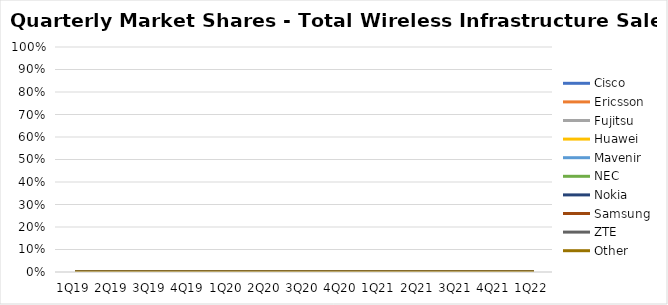
| Category | Cisco | Ericsson | Fujitsu | Huawei | Mavenir | NEC | Nokia | Samsung | ZTE | Other |
|---|---|---|---|---|---|---|---|---|---|---|
| 1Q19 | 0 | 0 | 0 | 0 | 0 | 0 | 0 | 0 | 0 | 0 |
| 2Q19 | 0 | 0 | 0 | 0 | 0 | 0 | 0 | 0 | 0 | 0 |
| 3Q19 | 0 | 0 | 0 | 0 | 0 | 0 | 0 | 0 | 0 | 0 |
| 4Q19 | 0 | 0 | 0 | 0 | 0 | 0 | 0 | 0 | 0 | 0 |
| 1Q20 | 0 | 0 | 0 | 0 | 0 | 0 | 0 | 0 | 0 | 0 |
| 2Q20 | 0 | 0 | 0 | 0 | 0 | 0 | 0 | 0 | 0 | 0 |
| 3Q20 | 0 | 0 | 0 | 0 | 0 | 0 | 0 | 0 | 0 | 0 |
| 4Q20 | 0 | 0 | 0 | 0 | 0 | 0 | 0 | 0 | 0 | 0 |
| 1Q21 | 0 | 0 | 0 | 0 | 0 | 0 | 0 | 0 | 0 | 0 |
| 2Q21 | 0 | 0 | 0 | 0 | 0 | 0 | 0 | 0 | 0 | 0 |
| 3Q21 | 0 | 0 | 0 | 0 | 0 | 0 | 0 | 0 | 0 | 0 |
| 4Q21 | 0 | 0 | 0 | 0 | 0 | 0 | 0 | 0 | 0 | 0 |
| 1Q22 | 0 | 0 | 0 | 0 | 0 | 0 | 0 | 0 | 0 | 0 |